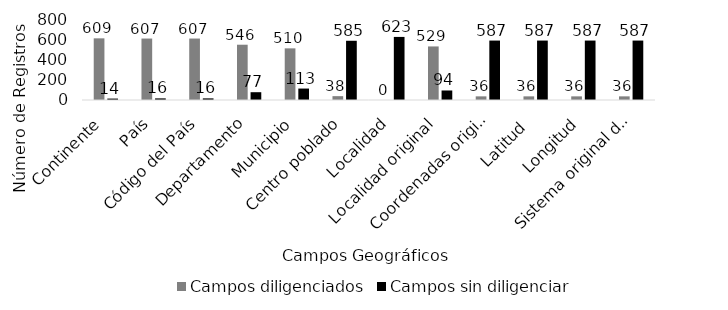
| Category | Campos diligenciados | Campos sin diligenciar |
|---|---|---|
| Continente | 609 | 14 |
| País | 607 | 16 |
| Código del País | 607 | 16 |
| Departamento | 546 | 77 |
| Municipio | 510 | 113 |
| Centro poblado | 38 | 585 |
| Localidad | 0 | 623 |
| Localidad original | 529 | 94 |
| Coordenadas original | 36 | 587 |
| Latitud  | 36 | 587 |
| Longitud | 36 | 587 |
| Sistema original de coordenadas | 36 | 587 |